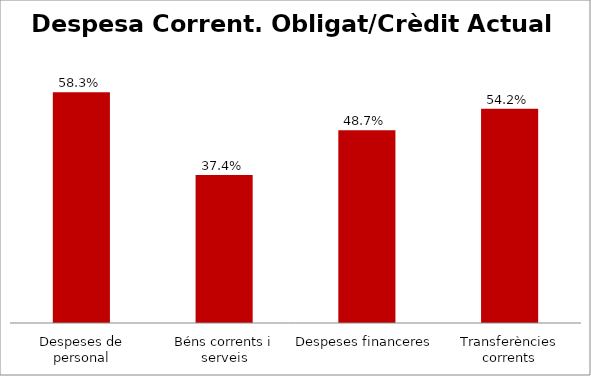
| Category | Series 0 |
|---|---|
| Despeses de personal | 0.583 |
| Béns corrents i serveis | 0.374 |
| Despeses financeres | 0.487 |
| Transferències corrents | 0.542 |